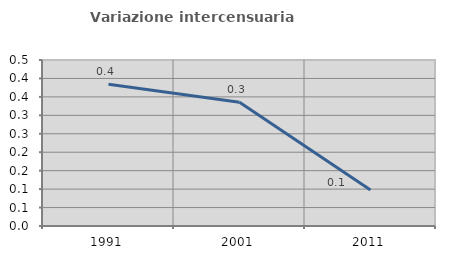
| Category | Variazione intercensuaria annua |
|---|---|
| 1991.0 | 0.385 |
| 2001.0 | 0.335 |
| 2011.0 | 0.098 |